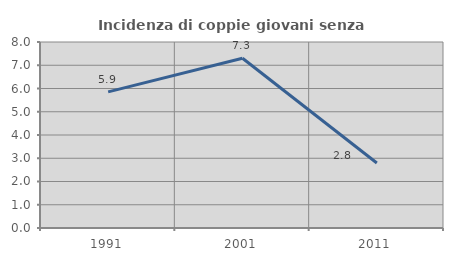
| Category | Incidenza di coppie giovani senza figli |
|---|---|
| 1991.0 | 5.857 |
| 2001.0 | 7.301 |
| 2011.0 | 2.798 |